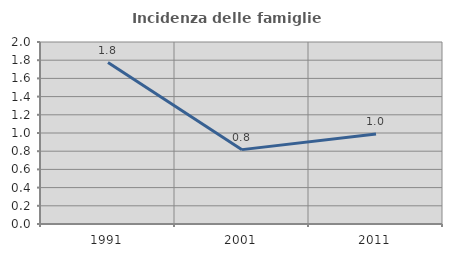
| Category | Incidenza delle famiglie numerose |
|---|---|
| 1991.0 | 1.774 |
| 2001.0 | 0.817 |
| 2011.0 | 0.988 |